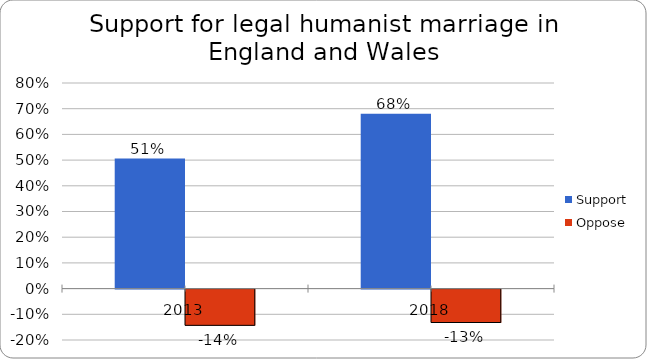
| Category | Support | Oppose |
|---|---|---|
| 2013.0 | 0.506 | -0.141 |
| 2018.0 | 0.68 | -0.13 |